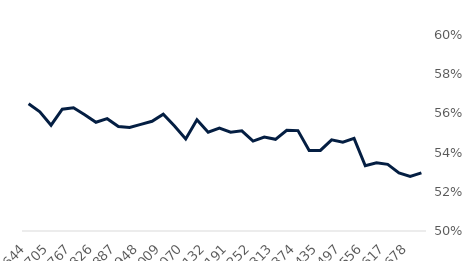
| Category | Series 0 |
|---|---|
| 2016-10-01 | 0.565 |
| 2016-11-01 | 0.561 |
| 2016-12-01 | 0.554 |
| 2017-01-01 | 0.562 |
| 2017-02-01 | 0.563 |
| 2017-03-01 | 0.559 |
| 2017-04-01 | 0.555 |
| 2017-05-01 | 0.557 |
| 2017-06-01 | 0.553 |
| 2017-07-01 | 0.553 |
| 2017-08-01 | 0.554 |
| 2017-09-01 | 0.556 |
| 2017-10-01 | 0.56 |
| 2017-11-01 | 0.554 |
| 2017-12-01 | 0.547 |
| 2018-01-01 | 0.557 |
| 2018-02-01 | 0.55 |
| 2018-03-01 | 0.552 |
| 2018-04-01 | 0.55 |
| 2018-05-01 | 0.551 |
| 2018-06-01 | 0.546 |
| 2018-07-01 | 0.548 |
| 2018-08-01 | 0.547 |
| 2018-09-01 | 0.551 |
| 2018-10-01 | 0.551 |
| 2018-11-01 | 0.541 |
| 2018-12-01 | 0.541 |
| 2019-01-01 | 0.546 |
| 2019-02-01 | 0.545 |
| 2019-03-01 | 0.547 |
| 2019-04-01 | 0.533 |
| 2019-05-01 | 0.535 |
| 2019-06-01 | 0.534 |
| 2019-07-01 | 0.53 |
| 2019-08-01 | 0.528 |
| 2019-09-01 | 0.53 |